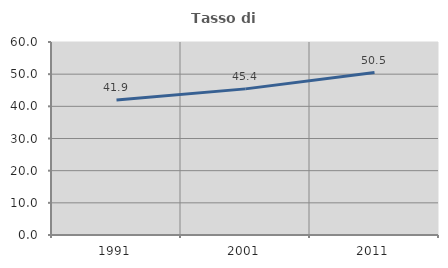
| Category | Tasso di occupazione   |
|---|---|
| 1991.0 | 41.946 |
| 2001.0 | 45.429 |
| 2011.0 | 50.517 |